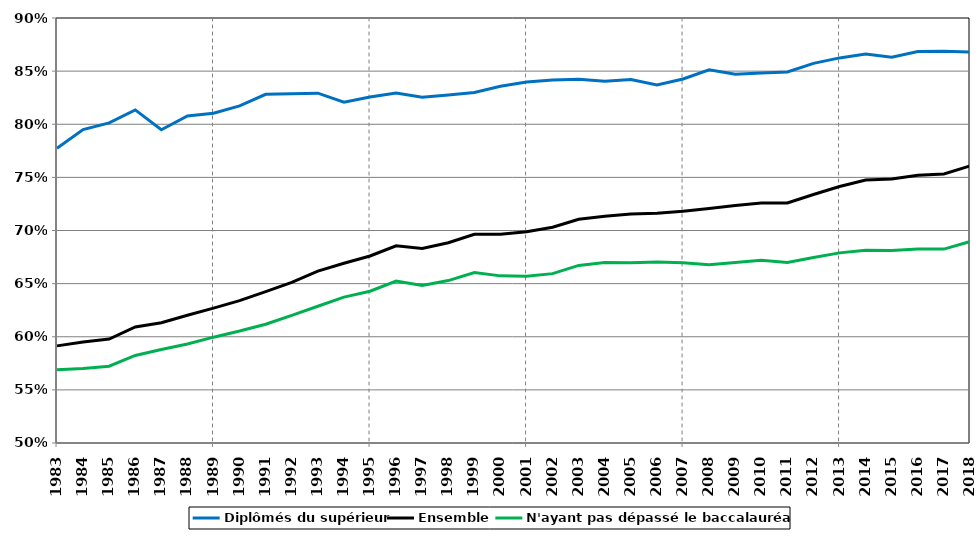
| Category | Diplômés du supérieur | Ensemble | N'ayant pas dépassé le baccalauréat* |
|---|---|---|---|
| 1983.0 | 0.777 | 0.591 | 0.569 |
| 1984.0 | 0.795 | 0.595 | 0.57 |
| 1985.0 | 0.801 | 0.598 | 0.572 |
| 1986.0 | 0.813 | 0.609 | 0.582 |
| 1987.0 | 0.795 | 0.613 | 0.588 |
| 1988.0 | 0.808 | 0.62 | 0.593 |
| 1989.0 | 0.81 | 0.627 | 0.6 |
| 1990.0 | 0.817 | 0.634 | 0.605 |
| 1991.0 | 0.828 | 0.642 | 0.612 |
| 1992.0 | 0.829 | 0.651 | 0.62 |
| 1993.0 | 0.829 | 0.662 | 0.629 |
| 1994.0 | 0.821 | 0.669 | 0.637 |
| 1995.0 | 0.826 | 0.676 | 0.643 |
| 1996.0 | 0.829 | 0.686 | 0.652 |
| 1997.0 | 0.825 | 0.683 | 0.648 |
| 1998.0 | 0.828 | 0.689 | 0.653 |
| 1999.0 | 0.83 | 0.696 | 0.66 |
| 2000.0 | 0.836 | 0.696 | 0.657 |
| 2001.0 | 0.84 | 0.699 | 0.657 |
| 2002.0 | 0.842 | 0.703 | 0.659 |
| 2003.0 | 0.842 | 0.711 | 0.667 |
| 2004.0 | 0.84 | 0.713 | 0.67 |
| 2005.0 | 0.842 | 0.715 | 0.67 |
| 2006.0 | 0.837 | 0.716 | 0.67 |
| 2007.0 | 0.843 | 0.718 | 0.67 |
| 2008.0 | 0.851 | 0.721 | 0.668 |
| 2009.0 | 0.847 | 0.723 | 0.67 |
| 2010.0 | 0.848 | 0.726 | 0.672 |
| 2011.0 | 0.849 | 0.726 | 0.67 |
| 2012.0 | 0.857 | 0.734 | 0.675 |
| 2013.0 | 0.862 | 0.741 | 0.679 |
| 2014.0 | 0.866 | 0.747 | 0.681 |
| 2015.0 | 0.863 | 0.749 | 0.681 |
| 2016.0 | 0.868 | 0.752 | 0.683 |
| 2017.0 | 0.869 | 0.753 | 0.682 |
| 2018.0 | 0.868 | 0.761 | 0.69 |